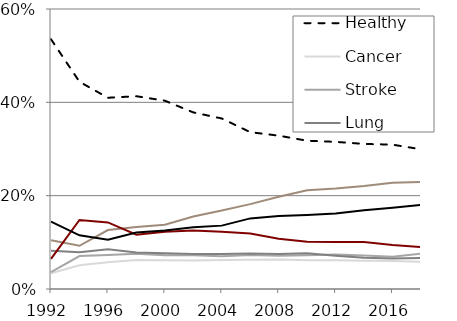
| Category | Healthy | Cancer | Stroke | Lung disease | Diabetes | Heart disease | Obesity |
|---|---|---|---|---|---|---|---|
| 1992.0 | 53.52 | 3.36 | 3.61 | 8.19 | 10.45 | 6.45 | 14.43 |
| 1994.0 | 44.41 | 5.1 | 7.07 | 7.87 | 9.26 | 14.79 | 11.5 |
| 1996.0 | 40.98 | 5.73 | 7.3 | 8.53 | 12.64 | 14.27 | 10.56 |
| 1998.0 | 41.31 | 6.21 | 7.58 | 7.84 | 13.31 | 11.63 | 12.12 |
| 2000.0 | 40.35 | 6.18 | 7.23 | 7.64 | 13.78 | 12.27 | 12.55 |
| 2002.0 | 37.84 | 6.11 | 7.22 | 7.51 | 15.53 | 12.56 | 13.24 |
| 2004.0 | 36.54 | 6.23 | 7.04 | 7.51 | 16.81 | 12.28 | 13.58 |
| 2006.0 | 33.61 | 6.26 | 7.31 | 7.62 | 18.19 | 11.88 | 15.13 |
| 2008.0 | 32.86 | 6.31 | 7.15 | 7.49 | 19.75 | 10.79 | 15.65 |
| 2010.0 | 31.77 | 6.16 | 7.24 | 7.65 | 21.17 | 10.14 | 15.87 |
| 2012.0 | 31.53 | 6.16 | 7.41 | 7.1 | 21.54 | 10.09 | 16.16 |
| 2014.0 | 31.09 | 6.05 | 7.19 | 6.68 | 22.06 | 10.06 | 16.87 |
| 2016.0 | 30.93 | 6.01 | 6.89 | 6.54 | 22.76 | 9.44 | 17.42 |
| 2018.0 | 29.94 | 5.84 | 7.6 | 6.62 | 22.95 | 9.01 | 18.04 |